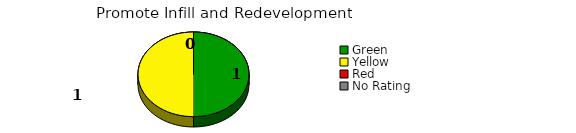
| Category | Counts |
|---|---|
| Green | 1 |
| Yellow | 1 |
| Red | 0 |
| No Rating | 0 |